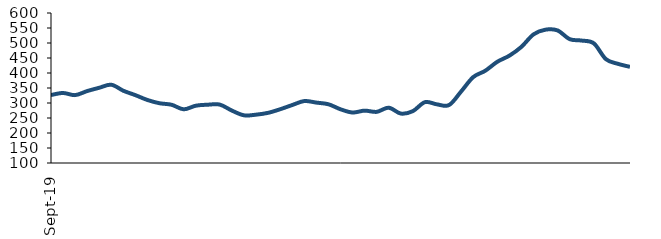
| Category | Series 0 |
|---|---|
| 2019-09-01 | 326.515 |
| 2019-10-01 | 333.383 |
| 2019-11-01 | 326.295 |
| 2019-12-01 | 339.824 |
| 2020-01-01 | 350.768 |
| 2020-02-01 | 360.883 |
| 2020-03-01 | 340.754 |
| 2020-04-01 | 326.108 |
| 2020-05-01 | 309.949 |
| 2020-06-01 | 299.181 |
| 2020-07-01 | 294.112 |
| 2020-08-01 | 278.992 |
| 2020-09-01 | 290.987 |
| 2020-10-01 | 294.359 |
| 2020-11-01 | 294.596 |
| 2020-12-01 | 274.651 |
| 2021-01-01 | 258.932 |
| 2021-02-01 | 261.112 |
| 2021-03-01 | 267.235 |
| 2021-04-01 | 279.241 |
| 2021-05-01 | 293.25 |
| 2021-06-01 | 306.524 |
| 2021-07-01 | 301.301 |
| 2021-08-01 | 295.799 |
| 2021-09-01 | 279.082 |
| 2021-10-01 | 268.296 |
| 2021-11-01 | 274.558 |
| 2021-12-01 | 270.511 |
| 2022-01-01 | 284.312 |
| 2022-02-01 | 264.809 |
| 2022-03-01 | 272.939 |
| 2022-04-01 | 302.833 |
| 2022-05-01 | 295.467 |
| 2022-06-01 | 293.185 |
| 2022-07-01 | 338.335 |
| 2022-08-01 | 386.233 |
| 2022-09-01 | 407.447 |
| 2022-10-01 | 437.443 |
| 2022-11-01 | 457.804 |
| 2022-12-01 | 487.211 |
| 2023-01-01 | 528.719 |
| 2023-02-01 | 544.441 |
| 2023-03-01 | 541.779 |
| 2023-04-01 | 512.769 |
| 2023-05-01 | 508.079 |
| 2023-06-01 | 498.924 |
| 2023-07-01 | 446.257 |
| 2023-08-01 | 430.605 |
| 2023-09-01 | 420.483 |